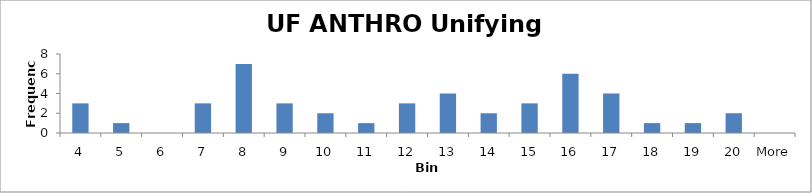
| Category | Frequency |
|---|---|
| 4 | 3 |
| 5 | 1 |
| 6 | 0 |
| 7 | 3 |
| 8 | 7 |
| 9 | 3 |
| 10 | 2 |
| 11 | 1 |
| 12 | 3 |
| 13 | 4 |
| 14 | 2 |
| 15 | 3 |
| 16 | 6 |
| 17 | 4 |
| 18 | 1 |
| 19 | 1 |
| 20 | 2 |
| More | 0 |